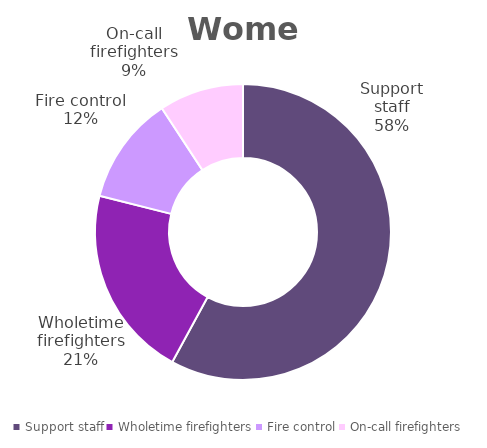
| Category | Women |
|---|---|
| Support staff | 0.579 |
| Wholetime firefighters | 0.21 |
| Fire control | 0.118 |
| On-call firefighters | 0.092 |